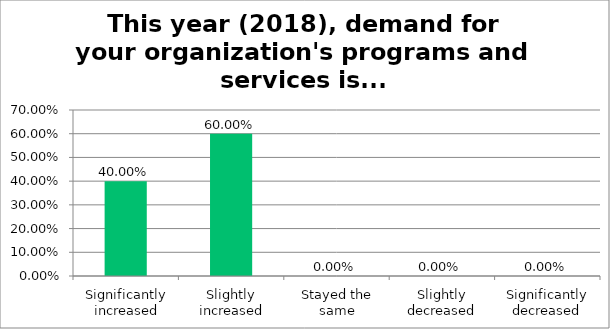
| Category | Responses |
|---|---|
| Significantly increased | 0.4 |
| Slightly increased | 0.6 |
| Stayed the same | 0 |
| Slightly decreased | 0 |
| Significantly decreased | 0 |